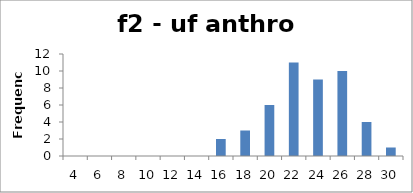
| Category | Frequency |
|---|---|
| 4.0 | 0 |
| 6.0 | 0 |
| 8.0 | 0 |
| 10.0 | 0 |
| 12.0 | 0 |
| 14.0 | 0 |
| 16.0 | 2 |
| 18.0 | 3 |
| 20.0 | 6 |
| 22.0 | 11 |
| 24.0 | 9 |
| 26.0 | 10 |
| 28.0 | 4 |
| 30.0 | 1 |